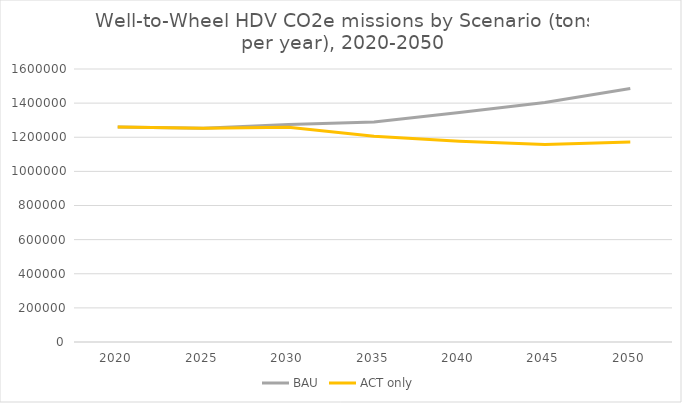
| Category | BAU | ACT only |
|---|---|---|
| 2020.0 | 1259403.032 | 1259403.032 |
| 2025.0 | 1252292.322 | 1252292.322 |
| 2030.0 | 1274061.967 | 1259271.328 |
| 2035.0 | 1289657.602 | 1206112.966 |
| 2040.0 | 1344749.078 | 1176161.269 |
| 2045.0 | 1403784.148 | 1157203.938 |
| 2050.0 | 1485614.331 | 1172105.508 |